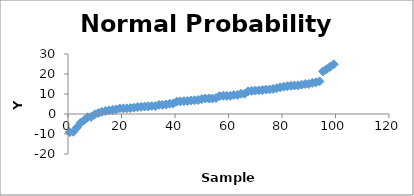
| Category | Series 0 |
|---|---|
| 0.6666666666666666 | -9.073 |
| 2.0 | -8.883 |
| 3.333333333333333 | -6.75 |
| 4.666666666666667 | -4.408 |
| 6.0 | -3.166 |
| 7.333333333333333 | -1.635 |
| 8.666666666666666 | -1.498 |
| 9.999999999999998 | -0.206 |
| 11.333333333333332 | 0.487 |
| 12.666666666666666 | 1.054 |
| 13.999999999999998 | 1.491 |
| 15.333333333333332 | 1.814 |
| 16.666666666666668 | 2.007 |
| 18.0 | 2.285 |
| 19.333333333333332 | 2.777 |
| 20.666666666666668 | 2.806 |
| 22.0 | 2.84 |
| 23.333333333333332 | 3.014 |
| 24.666666666666668 | 3.179 |
| 26.0 | 3.412 |
| 27.333333333333332 | 3.591 |
| 28.666666666666668 | 3.764 |
| 30.0 | 3.815 |
| 31.333333333333332 | 3.992 |
| 32.666666666666664 | 3.994 |
| 33.99999999999999 | 4.545 |
| 35.33333333333333 | 4.609 |
| 36.666666666666664 | 4.773 |
| 37.99999999999999 | 5.136 |
| 39.33333333333333 | 5.233 |
| 40.666666666666664 | 6.218 |
| 41.99999999999999 | 6.322 |
| 43.33333333333333 | 6.432 |
| 44.666666666666664 | 6.492 |
| 45.99999999999999 | 6.791 |
| 47.33333333333333 | 6.823 |
| 48.666666666666664 | 6.997 |
| 49.99999999999999 | 7.429 |
| 51.33333333333333 | 7.759 |
| 52.666666666666664 | 7.769 |
| 53.99999999999999 | 7.77 |
| 55.33333333333333 | 7.969 |
| 56.666666666666664 | 8.94 |
| 57.99999999999999 | 9.077 |
| 59.33333333333333 | 9.097 |
| 60.666666666666664 | 9.112 |
| 61.99999999999999 | 9.49 |
| 63.33333333333333 | 9.512 |
| 64.66666666666667 | 10.123 |
| 66.0 | 10.132 |
| 67.33333333333333 | 11.387 |
| 68.66666666666667 | 11.56 |
| 70.0 | 11.707 |
| 71.33333333333333 | 11.835 |
| 72.66666666666667 | 11.938 |
| 74.0 | 12.203 |
| 75.33333333333333 | 12.262 |
| 76.66666666666667 | 12.5 |
| 78.0 | 12.896 |
| 79.33333333333333 | 13.353 |
| 80.66666666666667 | 13.687 |
| 82.0 | 13.884 |
| 83.33333333333333 | 14.083 |
| 84.66666666666667 | 14.247 |
| 86.0 | 14.32 |
| 87.33333333333333 | 14.665 |
| 88.66666666666667 | 14.98 |
| 90.0 | 15.017 |
| 91.33333333333333 | 15.556 |
| 92.66666666666667 | 15.824 |
| 94.0 | 16.311 |
| 95.33333333333333 | 21.345 |
| 96.66666666666667 | 22.388 |
| 98.0 | 23.634 |
| 99.33333333333333 | 24.844 |